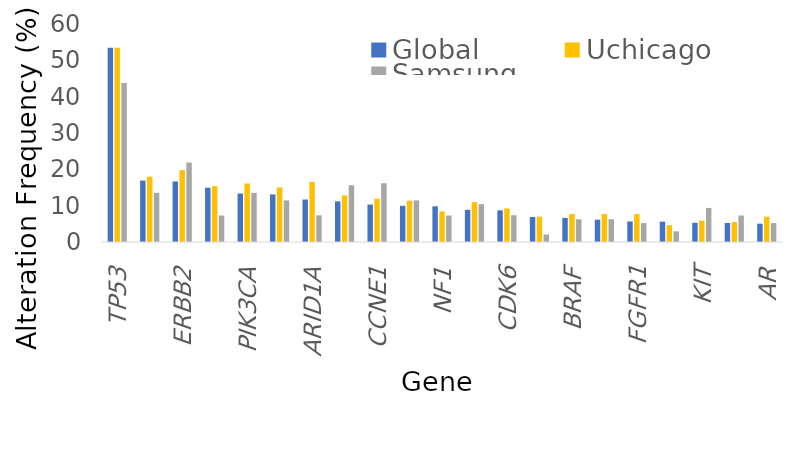
| Category | Global | Uchicago | Samsung |
|---|---|---|---|
| TP53 | 53.473 | 53.48 | 43.75 |
| EGFR | 16.902 | 17.949 | 13.542 |
| ERBB2 | 16.656 | 19.78 | 21.875 |
| KRAS | 14.935 | 15.385 | 7.292 |
| PIK3CA | 13.337 | 16.117 | 13.542 |
| MYC | 13.092 | 15.018 | 11.458 |
| ARID1A | 11.697 | 16.538 | 7.353 |
| MET | 11.186 | 12.821 | 15.625 |
| CCNE1 | 10.299 | 11.923 | 16.176 |
| APC | 9.957 | 11.355 | 11.458 |
| NF1 | 9.834 | 8.425 | 7.292 |
| FGFR2 | 8.851 | 10.989 | 10.417 |
| CDK6 | 8.709 | 9.231 | 7.353 |
| CDKN2A | 6.884 | 6.96 | 2.083 |
| BRAF | 6.638 | 7.692 | 6.25 |
| SMAD4 | 6.146 | 7.692 | 6.25 |
| FGFR1 | 5.655 | 7.692 | 5.208 |
| BRCA2 | 5.594 | 4.615 | 2.941 |
| KIT | 5.286 | 5.861 | 9.375 |
| PDGFRA | 5.224 | 5.495 | 7.292 |
| AR | 5.04 | 6.96 | 5.208 |